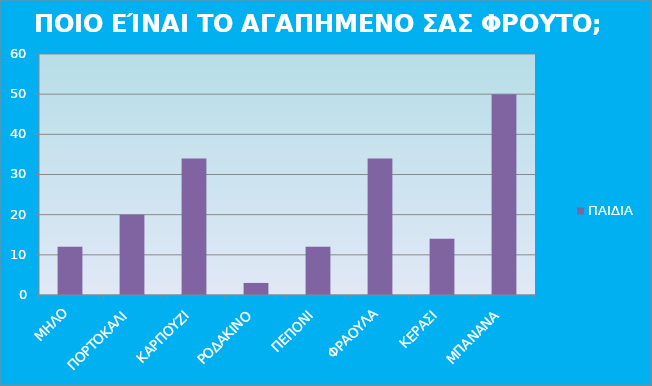
| Category | ΠΑΙΔΙΑ |
|---|---|
| ΜΗΛΟ | 12 |
| ΠΟΡΤΟΚΑΛΙ | 20 |
| ΚΑΡΠΟΥΖΙ | 34 |
| ΡΟΔΑΚΙΝΟ | 3 |
| ΠΕΠΟΝΙ | 12 |
| ΦΡΑΟΥΛΑ | 34 |
| ΚΕΡΑΣΙ | 14 |
| ΜΠΑΝΑΝΑ | 50 |